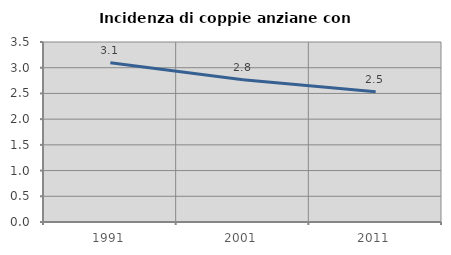
| Category | Incidenza di coppie anziane con figli |
|---|---|
| 1991.0 | 3.097 |
| 2001.0 | 2.768 |
| 2011.0 | 2.532 |